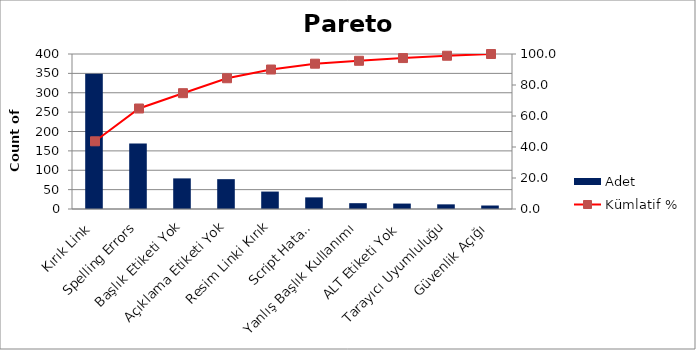
| Category | Adet |
|---|---|
| Kırık Link | 349 |
| Spelling Errors | 169 |
| Başlık Etiketi Yok | 79 |
| Açıklama Etiketi Yok | 77 |
| Resim Linki Kırık | 45 |
| Script Hatası | 30 |
| Yanlış Başlık Kullanımı | 15 |
| ALT Etiketi Yok | 14 |
| Tarayıcı Uyumluluğu | 12 |
| Güvenlik Açığı | 9 |